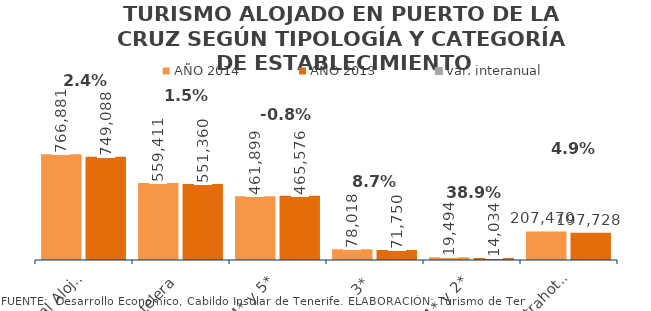
| Category | AÑO 2014 | AÑO 2013 |
|---|---|---|
| Total Alojados | 766881 | 749088 |
| Hotelera | 559411 | 551360 |
| 4* y 5* | 461899 | 465576 |
| 3* | 78018 | 71750 |
| 1* y 2* | 19494 | 14034 |
| Extrahotelera | 207470 | 197728 |